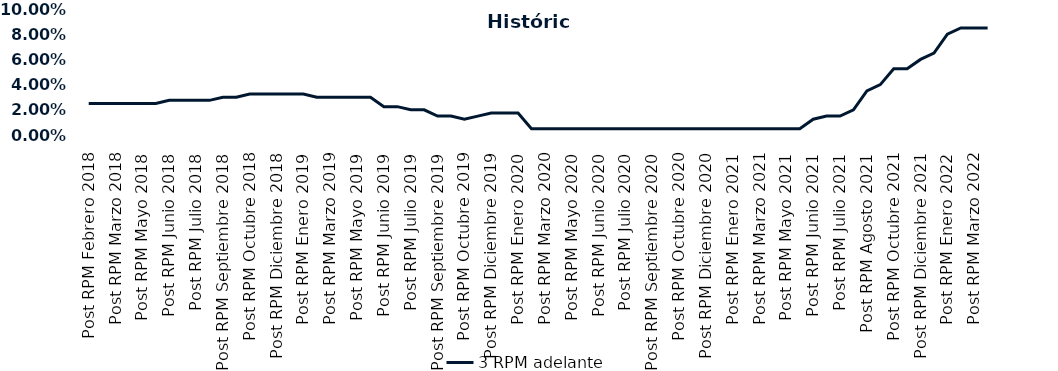
| Category | 3 RPM adelante |
|---|---|
| Post RPM Febrero 2018 | 0.025 |
| Pre RPM Marzo 2018 | 0.025 |
| Post RPM Marzo 2018 | 0.025 |
| Pre RPM Mayo 2018 | 0.025 |
| Post RPM Mayo 2018 | 0.025 |
| Pre RPM Junio 2018 | 0.025 |
| Post RPM Junio 2018 | 0.028 |
| Pre RPM Julio 2018 | 0.028 |
| Post RPM Julio 2018 | 0.028 |
| Pre RPM Septiembre 2018 | 0.028 |
| Post RPM Septiembre 2018 | 0.03 |
| Pre RPM Octubre 2018 | 0.03 |
| Post RPM Octubre 2018 | 0.032 |
| Pre RPM Diciembre 2018 | 0.032 |
| Post RPM Diciembre 2018 | 0.032 |
| Pre RPM Enero 2019 | 0.032 |
| Post RPM Enero 2019 | 0.032 |
| Pre RPM Marzo 2019 | 0.03 |
| Post RPM Marzo 2019 | 0.03 |
| Pre RPM Mayo 2019 | 0.03 |
| Post RPM Mayo 2019 | 0.03 |
| Pre RPM Junio 2019 | 0.03 |
| Post RPM Junio 2019 | 0.022 |
| Pre RPM Julio 2019 | 0.022 |
| Post RPM Julio 2019 | 0.02 |
| Pre RPM Septiembre 2019 | 0.02 |
| Post RPM Septiembre 2019 | 0.015 |
| Pre RPM Octubre 2019 | 0.015 |
| Post RPM Octubre 2019 | 0.012 |
| Pre RPM Diciembre 2019 | 0.015 |
| Post RPM Diciembre 2019 | 0.018 |
| Pre RPM Enero 2020 | 0.018 |
| Post RPM Enero 2020 | 0.018 |
| Pre RPM Marzo 2020 | 0.005 |
| Post RPM Marzo 2020 | 0.005 |
| Pre RPM Mayo 2020 | 0.005 |
| Post RPM Mayo 2020 | 0.005 |
| Pre RPM Junio 2020 | 0.005 |
| Post RPM Junio 2020 | 0.005 |
| Pre RPM Julio 2020 | 0.005 |
| Post RPM Julio 2020 | 0.005 |
| Pre RPM Septiembre 2020 | 0.005 |
| Post RPM Septiembre 2020 | 0.005 |
| Pre RPM Octubre 2020 | 0.005 |
| Post RPM Octubre 2020 | 0.005 |
| Pre RPM Diciembre 2020 | 0.005 |
| Post RPM Diciembre 2020 | 0.005 |
| Pre RPM Enero 2021 | 0.005 |
| Post RPM Enero 2021 | 0.005 |
| Pre RPM Marzo 2021 | 0.005 |
| Post RPM Marzo 2021 | 0.005 |
| Pre RPM Mayo 2021 | 0.005 |
| Post RPM Mayo 2021 | 0.005 |
| Pre RPM Junio 2021 | 0.005 |
| Post RPM Junio 2021 | 0.012 |
| Pre RPM Julio 2021 | 0.015 |
| Post RPM Julio 2021 | 0.015 |
| Pre RPM Agosto 2021 | 0.02 |
| Post RPM Agosto 2021 | 0.035 |
| Pre RPM Octubre 2021 | 0.04 |
| Post RPM Octubre 2021 | 0.052 |
| Pre RPM Diciembre 2021 | 0.052 |
| Post RPM Diciembre 2021 | 0.06 |
| Pre RPM Enero 2022 | 0.065 |
| Post RPM Enero 2022 | 0.08 |
| Pre RPM Marzo 2022 | 0.085 |
| Post RPM Marzo 2022 | 0.085 |
| Pre RPM Mayo 2022 | 0.085 |